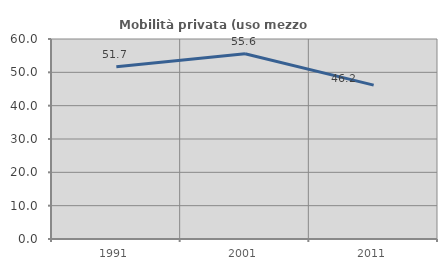
| Category | Mobilità privata (uso mezzo privato) |
|---|---|
| 1991.0 | 51.667 |
| 2001.0 | 55.556 |
| 2011.0 | 46.154 |